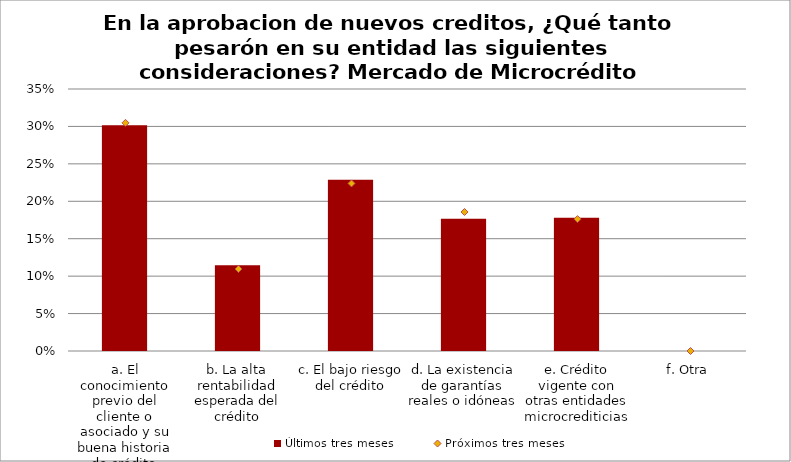
| Category | Últimos tres meses |
|---|---|
| a. El conocimiento previo del cliente o asociado y su buena historia de crédito | 0.302 |
| b. La alta rentabilidad esperada del crédito | 0.115 |
| c. El bajo riesgo del crédito | 0.229 |
| d. La existencia de garantías reales o idóneas | 0.177 |
| e. Crédito vigente con otras entidades microcrediticias | 0.178 |
| f. Otra | 0 |